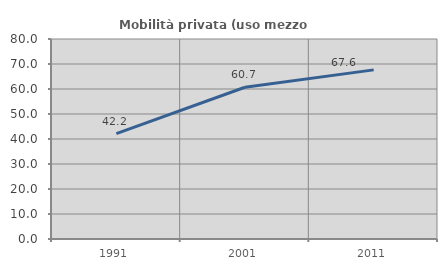
| Category | Mobilità privata (uso mezzo privato) |
|---|---|
| 1991.0 | 42.164 |
| 2001.0 | 60.701 |
| 2011.0 | 67.647 |